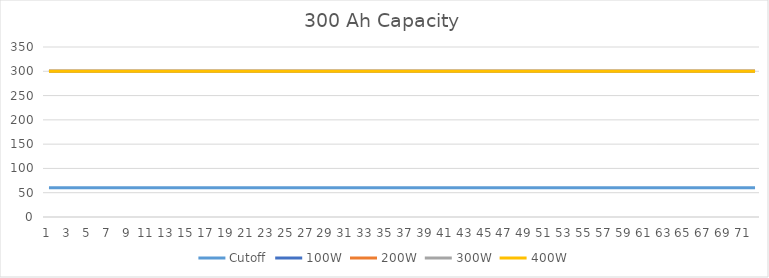
| Category | Cutoff | 100W | 200W | 300W | 400W |
|---|---|---|---|---|---|
| 0 | 60 | 300 | 300 | 300 | 300 |
| 1 | 60 | 300 | 300 | 300 | 300 |
| 2 | 60 | 300 | 300 | 300 | 300 |
| 3 | 60 | 300 | 300 | 300 | 300 |
| 4 | 60 | 300 | 300 | 300 | 300 |
| 5 | 60 | 300 | 300 | 300 | 300 |
| 6 | 60 | 300 | 300 | 300 | 300 |
| 7 | 60 | 300 | 300 | 300 | 300 |
| 8 | 60 | 300 | 300 | 300 | 300 |
| 9 | 60 | 300 | 300 | 300 | 300 |
| 10 | 60 | 300 | 300 | 300 | 300 |
| 11 | 60 | 300 | 300 | 300 | 300 |
| 12 | 60 | 300 | 300 | 300 | 300 |
| 13 | 60 | 300 | 300 | 300 | 300 |
| 14 | 60 | 300 | 300 | 300 | 300 |
| 15 | 60 | 300 | 300 | 300 | 300 |
| 16 | 60 | 300 | 300 | 300 | 300 |
| 17 | 60 | 300 | 300 | 300 | 300 |
| 18 | 60 | 300 | 300 | 300 | 300 |
| 19 | 60 | 300 | 300 | 300 | 300 |
| 20 | 60 | 300 | 300 | 300 | 300 |
| 21 | 60 | 300 | 300 | 300 | 300 |
| 22 | 60 | 300 | 300 | 300 | 300 |
| 23 | 60 | 300 | 300 | 300 | 300 |
| 24 | 60 | 300 | 300 | 300 | 300 |
| 25 | 60 | 300 | 300 | 300 | 300 |
| 26 | 60 | 300 | 300 | 300 | 300 |
| 27 | 60 | 300 | 300 | 300 | 300 |
| 28 | 60 | 300 | 300 | 300 | 300 |
| 29 | 60 | 300 | 300 | 300 | 300 |
| 30 | 60 | 300 | 300 | 300 | 300 |
| 31 | 60 | 300 | 300 | 300 | 300 |
| 32 | 60 | 300 | 300 | 300 | 300 |
| 33 | 60 | 300 | 300 | 300 | 300 |
| 34 | 60 | 300 | 300 | 300 | 300 |
| 35 | 60 | 300 | 300 | 300 | 300 |
| 36 | 60 | 300 | 300 | 300 | 300 |
| 37 | 60 | 300 | 300 | 300 | 300 |
| 38 | 60 | 300 | 300 | 300 | 300 |
| 39 | 60 | 300 | 300 | 300 | 300 |
| 40 | 60 | 300 | 300 | 300 | 300 |
| 41 | 60 | 300 | 300 | 300 | 300 |
| 42 | 60 | 300 | 300 | 300 | 300 |
| 43 | 60 | 300 | 300 | 300 | 300 |
| 44 | 60 | 300 | 300 | 300 | 300 |
| 45 | 60 | 300 | 300 | 300 | 300 |
| 46 | 60 | 300 | 300 | 300 | 300 |
| 47 | 60 | 300 | 300 | 300 | 300 |
| 48 | 60 | 300 | 300 | 300 | 300 |
| 49 | 60 | 300 | 300 | 300 | 300 |
| 50 | 60 | 300 | 300 | 300 | 300 |
| 51 | 60 | 300 | 300 | 300 | 300 |
| 52 | 60 | 300 | 300 | 300 | 300 |
| 53 | 60 | 300 | 300 | 300 | 300 |
| 54 | 60 | 300 | 300 | 300 | 300 |
| 55 | 60 | 300 | 300 | 300 | 300 |
| 56 | 60 | 300 | 300 | 300 | 300 |
| 57 | 60 | 300 | 300 | 300 | 300 |
| 58 | 60 | 300 | 300 | 300 | 300 |
| 59 | 60 | 300 | 300 | 300 | 300 |
| 60 | 60 | 300 | 300 | 300 | 300 |
| 61 | 60 | 300 | 300 | 300 | 300 |
| 62 | 60 | 300 | 300 | 300 | 300 |
| 63 | 60 | 300 | 300 | 300 | 300 |
| 64 | 60 | 300 | 300 | 300 | 300 |
| 65 | 60 | 300 | 300 | 300 | 300 |
| 66 | 60 | 300 | 300 | 300 | 300 |
| 67 | 60 | 300 | 300 | 300 | 300 |
| 68 | 60 | 300 | 300 | 300 | 300 |
| 69 | 60 | 300 | 300 | 300 | 300 |
| 70 | 60 | 300 | 300 | 300 | 300 |
| 71 | 60 | 300 | 300 | 300 | 300 |